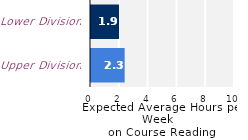
| Category | Series 0 |
|---|---|
| Upper Division | 2.338 |
| Lower Division | 1.946 |